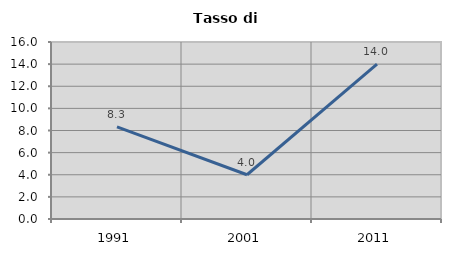
| Category | Tasso di disoccupazione   |
|---|---|
| 1991.0 | 8.333 |
| 2001.0 | 4 |
| 2011.0 | 14 |